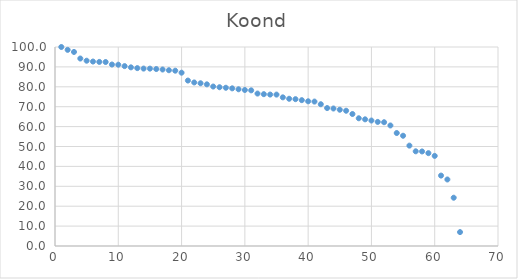
| Category | Series 0 |
|---|---|
| 0 | 100 |
| 1 | 98.57 |
| 2 | 97.51 |
| 3 | 94.207 |
| 4 | 93.107 |
| 5 | 92.694 |
| 6 | 92.509 |
| 7 | 92.454 |
| 8 | 91.192 |
| 9 | 91.101 |
| 10 | 90.395 |
| 11 | 89.776 |
| 12 | 89.386 |
| 13 | 89.156 |
| 14 | 89.131 |
| 15 | 88.926 |
| 16 | 88.69 |
| 17 | 88.326 |
| 18 | 88.095 |
| 19 | 87.088 |
| 20 | 83.138 |
| 21 | 82.184 |
| 22 | 81.779 |
| 23 | 81.239 |
| 24 | 80.134 |
| 25 | 79.782 |
| 26 | 79.519 |
| 27 | 79.226 |
| 28 | 78.756 |
| 29 | 78.399 |
| 30 | 78.221 |
| 31 | 76.604 |
| 32 | 76.296 |
| 33 | 76.099 |
| 34 | 76.083 |
| 35 | 74.702 |
| 36 | 73.987 |
| 37 | 73.783 |
| 38 | 73.286 |
| 39 | 72.723 |
| 40 | 72.575 |
| 41 | 71.243 |
| 42 | 69.317 |
| 43 | 69.093 |
| 44 | 68.471 |
| 45 | 67.968 |
| 46 | 66.328 |
| 47 | 64.185 |
| 48 | 63.654 |
| 49 | 63.047 |
| 50 | 62.356 |
| 51 | 62.195 |
| 52 | 60.571 |
| 53 | 56.769 |
| 54 | 55.404 |
| 55 | 50.437 |
| 56 | 47.587 |
| 57 | 47.512 |
| 58 | 46.662 |
| 59 | 45.278 |
| 60 | 35.383 |
| 61 | 33.428 |
| 62 | 24.262 |
| 63 | 6.987 |